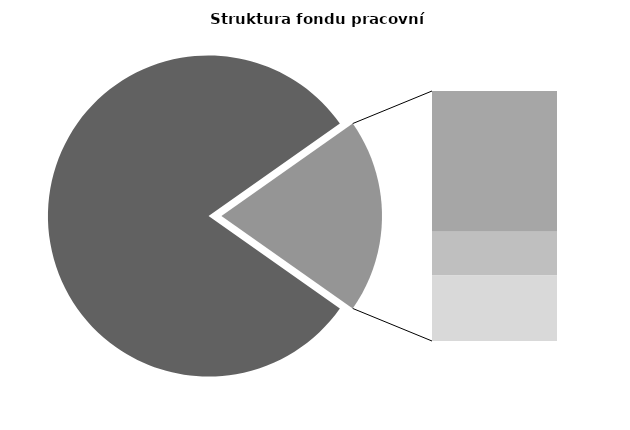
| Category | Series 0 |
|---|---|
| Průměrná měsíční odpracovaná doba bez přesčasu | 138.325 |
| Dovolená | 18.897 |
| Nemoc | 5.879 |
| Jiné | 8.793 |